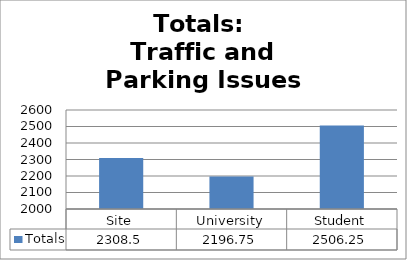
| Category | Totals |
|---|---|
| Site | 2308.5 |
| University | 2196.75 |
| Student | 2506.25 |